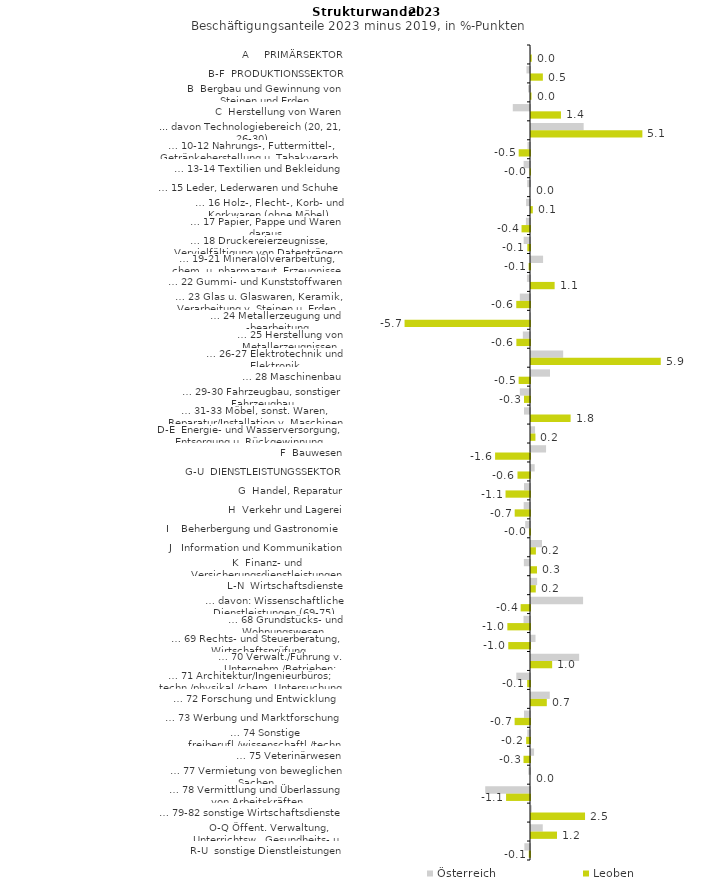
| Category | Österreich | Leoben |
|---|---|---|
| A     PRIMÄRSEKTOR | -0.007 | 0.034 |
| B-F  PRODUKTIONSSEKTOR | -0.161 | 0.54 |
| B  Bergbau und Gewinnung von Steinen und Erden | -0.086 | 0.023 |
| C  Herstellung von Waren | -0.782 | 1.362 |
| ... davon Technologiebereich (20, 21, 26-30) | 2.393 | 5.063 |
| … 10-12 Nahrungs-, Futtermittel-, Getränkeherstellung u. Tabakverarb. | -0.116 | -0.514 |
| … 13-14 Textilien und Bekleidung | -0.289 | -0.021 |
| … 15 Leder, Lederwaren und Schuhe | -0.13 | 0 |
| … 16 Holz-, Flecht-, Korb- und Korkwaren (ohne Möbel)  | -0.177 | 0.082 |
| … 17 Papier, Pappe und Waren daraus  | -0.185 | -0.385 |
| … 18 Druckereierzeugnisse, Vervielfältigung von Datenträgern | -0.288 | -0.122 |
| … 19-21 Mineralölverarbeitung, chem. u. pharmazeut. Erzeugnisse | 0.549 | -0.061 |
| … 22 Gummi- und Kunststoffwaren | -0.139 | 1.074 |
| … 23 Glas u. Glaswaren, Keramik, Verarbeitung v. Steinen u. Erden  | -0.462 | -0.624 |
| … 24 Metallerzeugung und -bearbeitung | -0.032 | -5.702 |
| … 25 Herstellung von Metallerzeugnissen  | -0.325 | -0.62 |
| … 26-27 Elektrotechnik und Elektronik | 1.462 | 5.898 |
| … 28 Maschinenbau | 0.864 | -0.516 |
| … 29-30 Fahrzeugbau, sonstiger Fahrzeugbau | -0.462 | -0.274 |
| … 31-33 Möbel, sonst. Waren, Reparatur/Installation v. Maschinen | -0.273 | 1.801 |
| D-E  Energie- und Wasserversorgung, Entsorgung u. Rückgewinnung | 0.184 | 0.201 |
| F  Bauwesen | 0.684 | -1.587 |
| G-U  DIENSTLEISTUNGSSEKTOR | 0.167 | -0.569 |
| G  Handel, Reparatur | -0.273 | -1.112 |
| H  Verkehr und Lagerei | -0.287 | -0.696 |
| I    Beherbergung und Gastronomie | -0.218 | -0.041 |
| J   Information und Kommunikation | 0.499 | 0.223 |
| K  Finanz- und Versicherungsdienstleistungen | -0.279 | 0.273 |
| L-N  Wirtschaftsdienste | 0.279 | 0.217 |
| … davon: Wissenschaftliche Dienstleistungen (69-75) | 2.367 | -0.425 |
| … 68 Grundstücks- und Wohnungswesen  | -0.294 | -1.03 |
| … 69 Rechts- und Steuerberatung, Wirtschaftsprüfung | 0.205 | -0.988 |
| … 70 Verwalt./Führung v. Unternehm./Betrieben; Unternehmensberat. | 2.188 | 0.962 |
| … 71 Architektur/Ingenieurbüros; techn./physikal./chem. Untersuchung | -0.622 | -0.129 |
| … 72 Forschung und Entwicklung  | 0.854 | 0.719 |
| … 73 Werbung und Marktforschung | -0.273 | -0.699 |
| … 74 Sonstige freiberufl./wissenschaftl./techn. Tätigkeiten | -0.124 | -0.174 |
| … 75 Veterinärwesen | 0.14 | -0.295 |
| … 77 Vermietung von beweglichen Sachen  | -0.077 | 0 |
| … 78 Vermittlung und Überlassung von Arbeitskräften | -2.035 | -1.088 |
| … 79-82 sonstige Wirtschaftsdienste | 0.039 | 2.456 |
| O-Q Öffent. Verwaltung, Unterrichtsw., Gesundheits- u. Sozialwesen | 0.535 | 1.183 |
| R-U  sonstige Dienstleistungen | -0.256 | -0.055 |